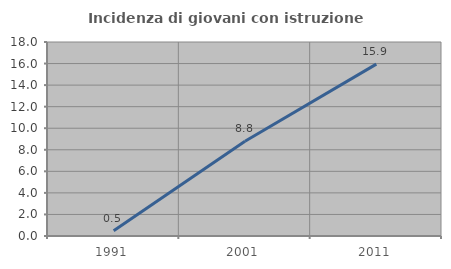
| Category | Incidenza di giovani con istruzione universitaria |
|---|---|
| 1991.0 | 0.485 |
| 2001.0 | 8.796 |
| 2011.0 | 15.945 |